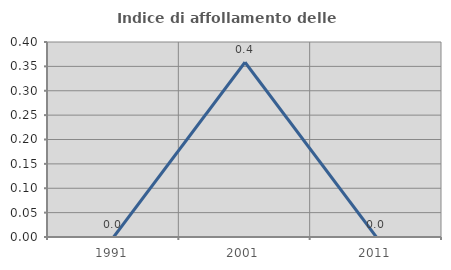
| Category | Indice di affollamento delle abitazioni  |
|---|---|
| 1991.0 | 0 |
| 2001.0 | 0.358 |
| 2011.0 | 0 |